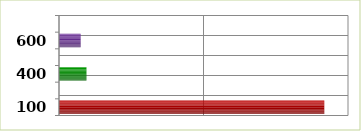
| Category | Series 0 |
|---|---|
| 100.0 | 3672000 |
| 200.0 | 0 |
| 400.0 | 380000 |
| 500.0 | 0 |
| 600.0 | 300000 |
| 700.0 | 0 |